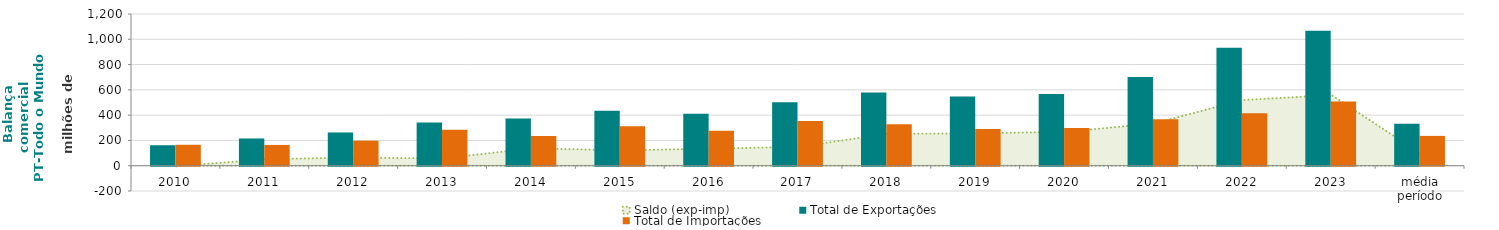
| Category | Total de Exportações  | Total de Importações  |
|---|---|---|
| 2010 | 161.954 | 165.794 |
| 2011 | 215.436 | 164.427 |
| 2012 | 263.032 | 198.156 |
| 2013 | 341.033 | 284.1 |
| 2014 | 372.973 | 235.023 |
| 2015 | 434.161 | 312.304 |
| 2016 | 411.746 | 277.469 |
| 2017 | 502.76 | 353.223 |
| 2018 | 578.834 | 327.015 |
| 2019 | 547.117 | 290.935 |
| 2020 | 566.397 | 298.648 |
| 2021 | 701.622 | 367.725 |
| 2022 | 933.932 | 414.51 |
| 2023 | 1066.757 | 508.4 |
| média período | 331.536 | 235.727 |